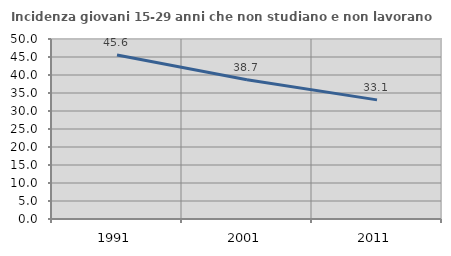
| Category | Incidenza giovani 15-29 anni che non studiano e non lavorano  |
|---|---|
| 1991.0 | 45.568 |
| 2001.0 | 38.662 |
| 2011.0 | 33.093 |